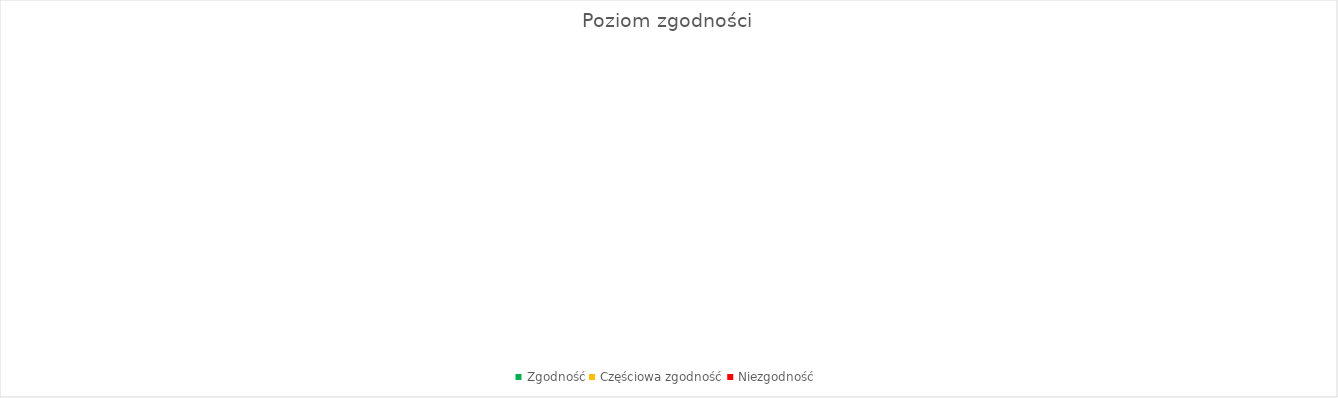
| Category | Series 0 |
|---|---|
| Zgodność | 0 |
| Częściowa zgodność | 0 |
| Niezgodność | 0 |